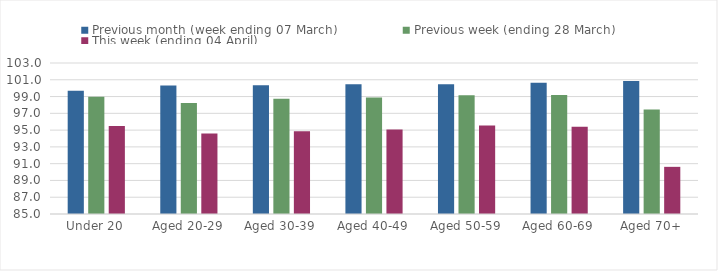
| Category | Previous month (week ending 07 March) | Previous week (ending 28 March) | This week (ending 04 April) |
|---|---|---|---|
| Under 20 | 99.679 | 98.989 | 95.502 |
| Aged 20-29 | 100.31 | 98.236 | 94.582 |
| Aged 30-39 | 100.336 | 98.744 | 94.869 |
| Aged 40-49 | 100.48 | 98.882 | 95.058 |
| Aged 50-59 | 100.476 | 99.146 | 95.54 |
| Aged 60-69 | 100.64 | 99.18 | 95.403 |
| Aged 70+ | 100.85 | 97.458 | 90.621 |